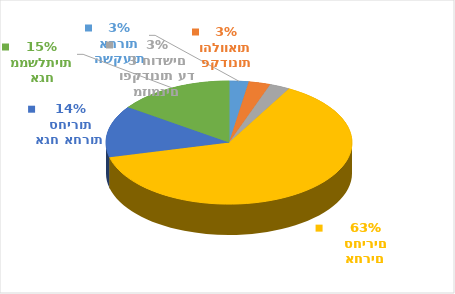
| Category | Series 0 | Series 1 |
|---|---|---|
| השקעות אחרות | 504.781 | 0.026 |
| פקדונות והלוואות | 565.889 | 0.029 |
| מזומנים ופקדונות עד 3 חודשים | 523.39 | 0.027 |
| ניירות ערך אחרים סחירים | 12436.246 | 0.631 |
| אגח אחרות סחירות | 2674.529 | 0.136 |
| אגח ממשלתיות | 3015.519 | 0.153 |